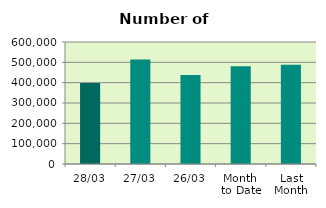
| Category | Series 0 |
|---|---|
| 28/03 | 398482 |
| 27/03 | 514182 |
| 26/03 | 437980 |
| Month 
to Date | 480423.4 |
| Last
Month | 488116.6 |